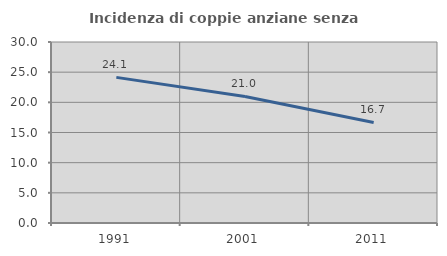
| Category | Incidenza di coppie anziane senza figli  |
|---|---|
| 1991.0 | 24.138 |
| 2001.0 | 20.968 |
| 2011.0 | 16.667 |